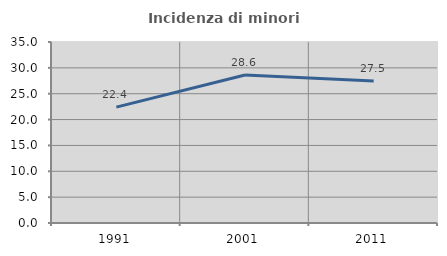
| Category | Incidenza di minori stranieri |
|---|---|
| 1991.0 | 22.414 |
| 2001.0 | 28.62 |
| 2011.0 | 27.474 |